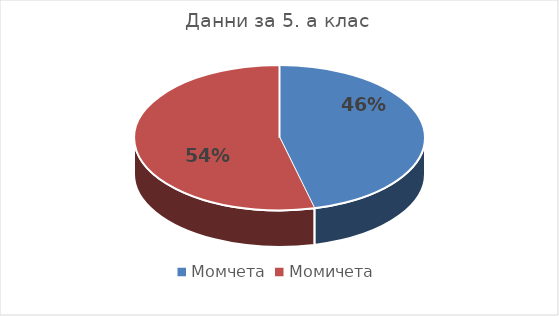
| Category | Series 0 |
|---|---|
| Момчета | 12 |
| Момичета | 14 |